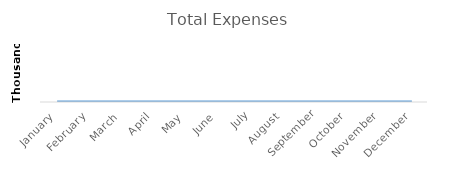
| Category | Total Expenses |
|---|---|
| January | 0 |
| February | 0 |
| March | 0 |
| April | 0 |
| May | 0 |
| June | 0 |
| July | 0 |
| August | 0 |
| September | 0 |
| October | 0 |
| November | 0 |
| December | 0 |